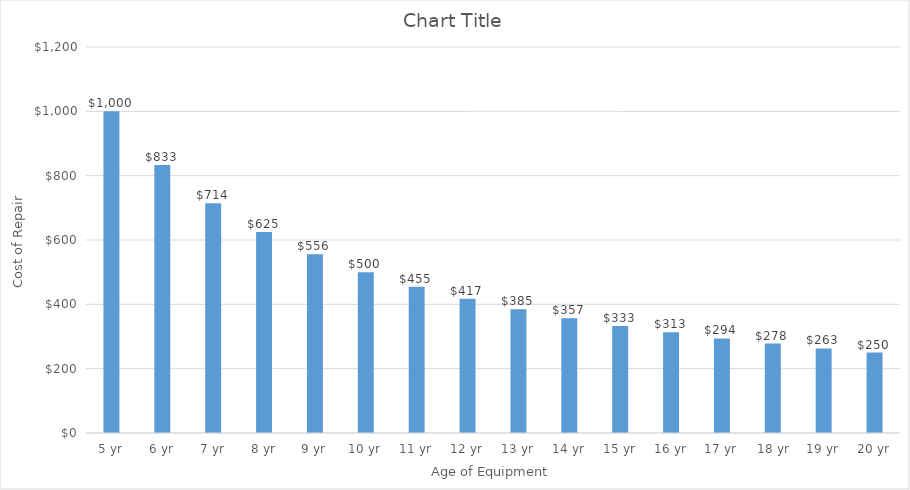
| Category | Series 0 |
|---|---|
| 5 yr | 1000 |
| 6 yr | 833 |
| 7 yr | 714 |
| 8 yr | 625 |
| 9 yr | 556 |
| 10 yr | 500 |
| 11 yr | 455 |
| 12 yr | 417 |
| 13 yr | 385 |
| 14 yr | 357 |
| 15 yr | 333 |
| 16 yr | 313 |
| 17 yr | 294 |
|  18 yr | 278 |
| 19 yr | 263 |
| 20 yr | 250 |